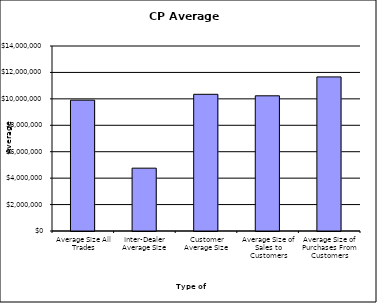
| Category | Security Type |
|---|---|
| Average Size All Trades | 9899370.067 |
| Inter-Dealer Average Size | 4755355.14 |
| Customer Average Size | 10344685.275 |
| Average Size of Sales to Customers | 10231384.886 |
| Average Size of Purchases From Customers | 11660357.143 |